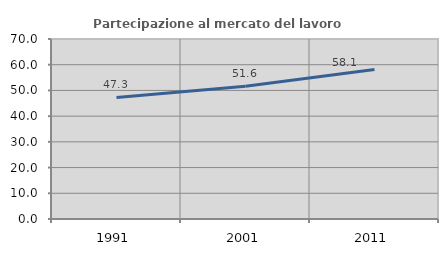
| Category | Partecipazione al mercato del lavoro  femminile |
|---|---|
| 1991.0 | 47.279 |
| 2001.0 | 51.623 |
| 2011.0 | 58.127 |